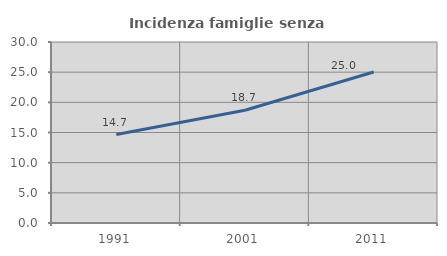
| Category | Incidenza famiglie senza nuclei |
|---|---|
| 1991.0 | 14.652 |
| 2001.0 | 18.684 |
| 2011.0 | 25.027 |